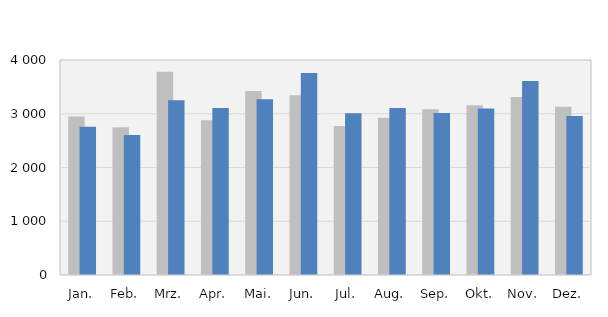
| Category | 2017 | 2018 |
|---|---|---|
| Jan. | 2947 | 2759 |
| Feb. | 2747 | 2604 |
| Mrz. | 3780 | 3253 |
| Apr. | 2879 | 3106 |
| Mai. | 3421 | 3269 |
| Jun. | 3346 | 3756 |
| Jul. | 2772 | 3007 |
| Aug. | 2925 | 3108 |
| Sep. | 3082 | 3013 |
| Okt. | 3159 | 3098 |
| Nov. | 3313 | 3609 |
| Dez. | 3128 | 2956 |